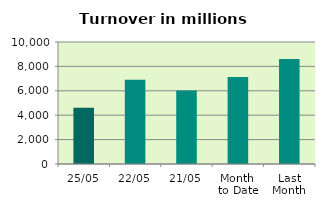
| Category | Series 0 |
|---|---|
| 25/05 | 4613.712 |
| 22/05 | 6905.9 |
| 21/05 | 6026.069 |
| Month 
to Date | 7136.603 |
| Last
Month | 8604.869 |